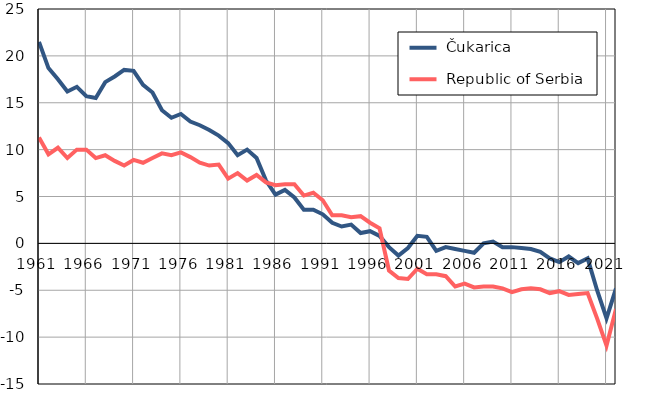
| Category |  Čukarica |  Republic of Serbia |
|---|---|---|
| 1961.0 | 21.5 | 11.3 |
| 1962.0 | 18.7 | 9.5 |
| 1963.0 | 17.5 | 10.2 |
| 1964.0 | 16.2 | 9.1 |
| 1965.0 | 16.7 | 10 |
| 1966.0 | 15.7 | 10 |
| 1967.0 | 15.5 | 9.1 |
| 1968.0 | 17.2 | 9.4 |
| 1969.0 | 17.8 | 8.8 |
| 1970.0 | 18.5 | 8.3 |
| 1971.0 | 18.4 | 8.9 |
| 1972.0 | 16.9 | 8.6 |
| 1973.0 | 16.1 | 9.1 |
| 1974.0 | 14.2 | 9.6 |
| 1975.0 | 13.4 | 9.4 |
| 1976.0 | 13.8 | 9.7 |
| 1977.0 | 13 | 9.2 |
| 1978.0 | 12.6 | 8.6 |
| 1979.0 | 12.1 | 8.3 |
| 1980.0 | 11.5 | 8.4 |
| 1981.0 | 10.7 | 6.9 |
| 1982.0 | 9.4 | 7.5 |
| 1983.0 | 10 | 6.7 |
| 1984.0 | 9.1 | 7.3 |
| 1985.0 | 6.7 | 6.5 |
| 1986.0 | 5.2 | 6.2 |
| 1987.0 | 5.7 | 6.3 |
| 1988.0 | 4.9 | 6.3 |
| 1989.0 | 3.6 | 5.1 |
| 1990.0 | 3.6 | 5.4 |
| 1991.0 | 3.1 | 4.6 |
| 1992.0 | 2.2 | 3 |
| 1993.0 | 1.8 | 3 |
| 1994.0 | 2 | 2.8 |
| 1995.0 | 1.1 | 2.9 |
| 1996.0 | 1.3 | 2.2 |
| 1997.0 | 0.8 | 1.6 |
| 1998.0 | -0.4 | -2.9 |
| 1999.0 | -1.3 | -3.7 |
| 2000.0 | -0.5 | -3.8 |
| 2001.0 | 0.8 | -2.7 |
| 2002.0 | 0.7 | -3.3 |
| 2003.0 | -0.8 | -3.3 |
| 2004.0 | -0.4 | -3.5 |
| 2005.0 | -0.6 | -4.6 |
| 2006.0 | -0.8 | -4.3 |
| 2007.0 | -1 | -4.7 |
| 2008.0 | 0 | -4.6 |
| 2009.0 | 0.2 | -4.6 |
| 2010.0 | -0.4 | -4.8 |
| 2011.0 | -0.4 | -5.2 |
| 2012.0 | -0.5 | -4.9 |
| 2013.0 | -0.6 | -4.8 |
| 2014.0 | -0.9 | -4.9 |
| 2015.0 | -1.6 | -5.3 |
| 2016.0 | -2 | -5.1 |
| 2017.0 | -1.4 | -5.5 |
| 2018.0 | -2.1 | -5.4 |
| 2019.0 | -1.6 | -5.3 |
| 2020.0 | -5 | -8 |
| 2021.0 | -8 | -10.9 |
| 2022.0 | -4.8 | -7 |